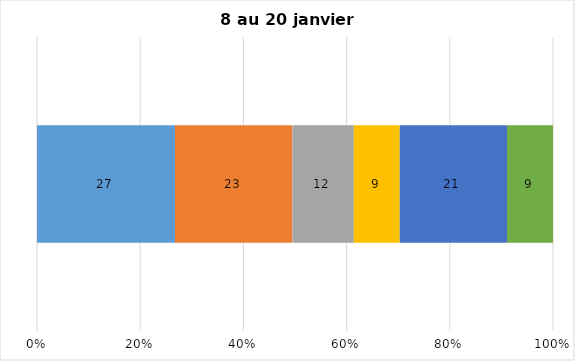
| Category | Plusieurs fois par jour | Une fois par jour | Quelques fois par semaine   | Une fois par semaine ou moins   |  Jamais   |  Je n’utilise pas les médias sociaux |
|---|---|---|---|---|---|---|
| 0 | 27 | 23 | 12 | 9 | 21 | 9 |